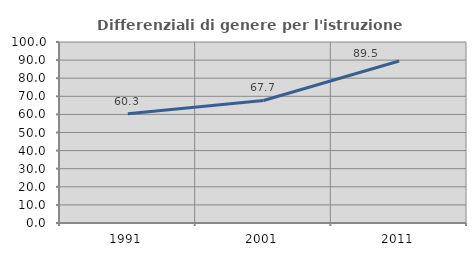
| Category | Differenziali di genere per l'istruzione superiore |
|---|---|
| 1991.0 | 60.343 |
| 2001.0 | 67.692 |
| 2011.0 | 89.532 |